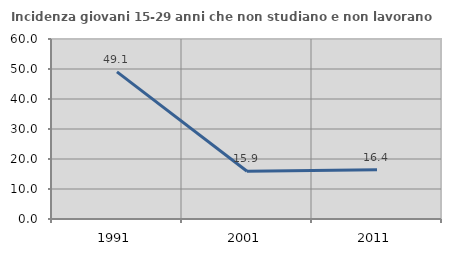
| Category | Incidenza giovani 15-29 anni che non studiano e non lavorano  |
|---|---|
| 1991.0 | 49.058 |
| 2001.0 | 15.9 |
| 2011.0 | 16.444 |